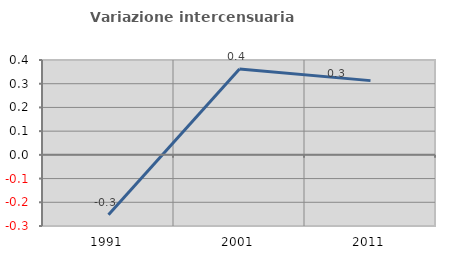
| Category | Variazione intercensuaria annua |
|---|---|
| 1991.0 | -0.253 |
| 2001.0 | 0.362 |
| 2011.0 | 0.313 |